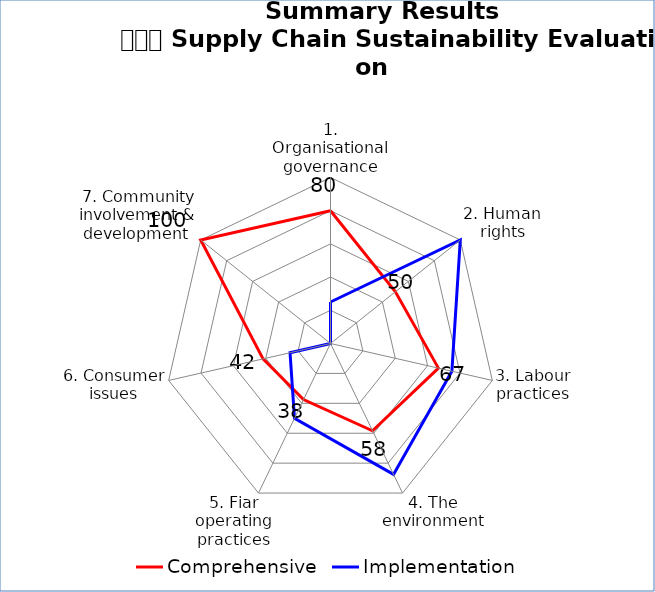
| Category | Comprehensive  | Implementation |
|---|---|---|
| 1. Organisational governance | 80 | 25 |
| 2. Human rights | 50 | 100 |
| 3. Labour practices | 66.667 | 75 |
| 4. The environment | 58.333 | 87.5 |
| 5. Fiar operating practices | 37.5 | 50 |
| 6. Consumer issues | 41.667 | 25 |
| 7. Community involvement & development  | 100 | 0 |